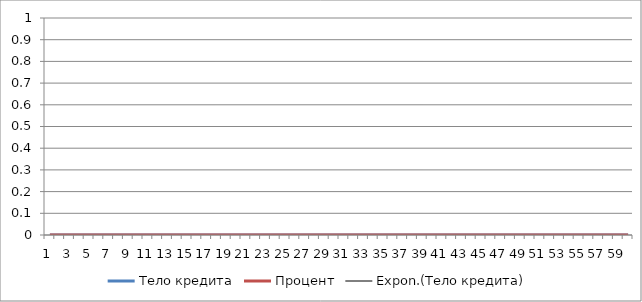
| Category | Тело кредита | Процент |
|---|---|---|
| 0 | 1128.993 | 1250 |
| 1 | 1143.105 | 1235.888 |
| 2 | 1157.394 | 1221.599 |
| 3 | 1171.862 | 1207.131 |
| 4 | 1186.51 | 1192.483 |
| 5 | 1201.341 | 1177.652 |
| 6 | 1216.358 | 1162.635 |
| 7 | 1231.563 | 1147.43 |
| 8 | 1246.957 | 1132.036 |
| 9 | 1262.544 | 1116.449 |
| 10 | 1278.326 | 1100.667 |
| 11 | 1294.305 | 1084.688 |
| 12 | 1310.484 | 1068.509 |
| 13 | 1326.865 | 1052.128 |
| 14 | 1343.451 | 1035.542 |
| 15 | 1360.244 | 1018.749 |
| 16 | 1377.247 | 1001.746 |
| 17 | 1394.462 | 984.531 |
| 18 | 1411.893 | 967.1 |
| 19 | 1429.542 | 949.451 |
| 20 | 1447.411 | 931.582 |
| 21 | 1465.504 | 913.489 |
| 22 | 1483.823 | 895.171 |
| 23 | 1502.37 | 876.623 |
| 24 | 1521.15 | 857.843 |
| 25 | 1540.164 | 838.829 |
| 26 | 1559.416 | 819.577 |
| 27 | 1578.909 | 800.084 |
| 28 | 1598.645 | 780.348 |
| 29 | 1618.628 | 760.365 |
| 30 | 1638.861 | 740.132 |
| 31 | 1659.347 | 719.646 |
| 32 | 1680.089 | 698.904 |
| 33 | 1701.09 | 677.903 |
| 34 | 1722.354 | 656.639 |
| 35 | 1743.883 | 635.11 |
| 36 | 1765.682 | 613.311 |
| 37 | 1787.753 | 591.24 |
| 38 | 1810.1 | 568.893 |
| 39 | 1832.726 | 546.267 |
| 40 | 1855.635 | 523.358 |
| 41 | 1878.83 | 500.163 |
| 42 | 1902.316 | 476.677 |
| 43 | 1926.095 | 452.898 |
| 44 | 1950.171 | 428.822 |
| 45 | 1974.548 | 404.445 |
| 46 | 1999.23 | 379.763 |
| 47 | 2024.22 | 354.773 |
| 48 | 2049.523 | 329.47 |
| 49 | 2075.142 | 303.851 |
| 50 | 2101.081 | 277.912 |
| 51 | 2127.345 | 251.648 |
| 52 | 2153.937 | 225.056 |
| 53 | 2180.861 | 198.132 |
| 54 | 2208.122 | 170.871 |
| 55 | 2235.723 | 143.27 |
| 56 | 2263.67 | 115.323 |
| 57 | 2291.965 | 87.028 |
| 58 | 2320.615 | 58.378 |
| 59 | 2349.623 | 29.37 |